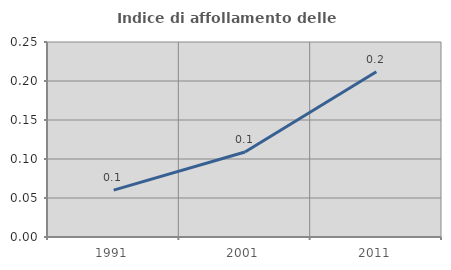
| Category | Indice di affollamento delle abitazioni  |
|---|---|
| 1991.0 | 0.06 |
| 2001.0 | 0.109 |
| 2011.0 | 0.212 |